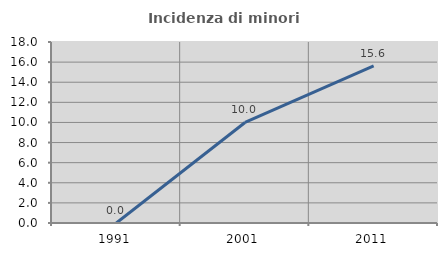
| Category | Incidenza di minori stranieri |
|---|---|
| 1991.0 | 0 |
| 2001.0 | 10 |
| 2011.0 | 15.625 |